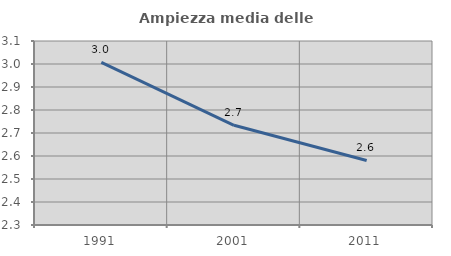
| Category | Ampiezza media delle famiglie |
|---|---|
| 1991.0 | 3.007 |
| 2001.0 | 2.733 |
| 2011.0 | 2.581 |